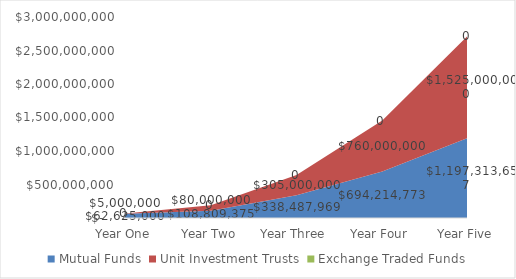
| Category | Mutual Funds | Unit Investment Trusts | Exchange Traded Funds |
|---|---|---|---|
|  Year One  | 62625000 | 5000000 |  |
|  Year Two  | 108809375 | 80000000 |  |
|  Year Three  | 338487968.75 | 305000000 |  |
|  Year Four  | 694214773.438 | 760000000 |  |
|  Year Five  | 1197313657.031 | 1525000000 |  |